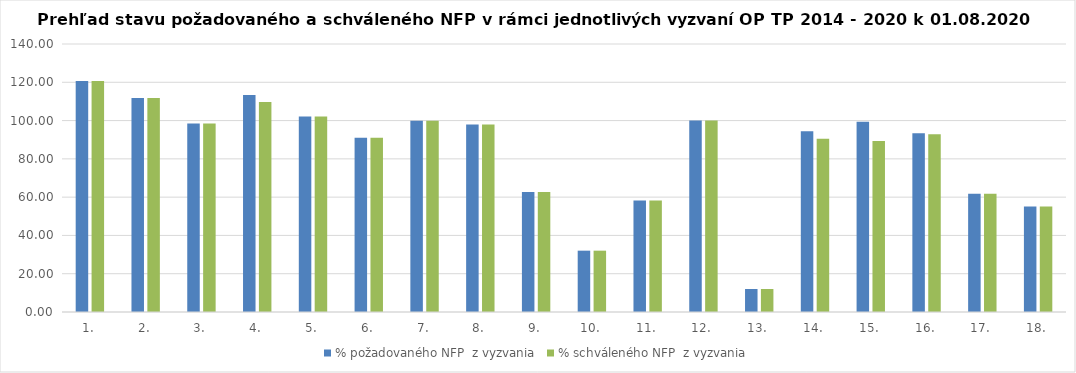
| Category | % požadovaného NFP  z vyzvania | % schváleného NFP  z vyzvania |
|---|---|---|
| 1. | 120.662 | 120.662 |
| 2. | 111.83 | 111.83 |
| 3. | 98.465 | 98.465 |
| 4. | 113.295 | 109.758 |
| 5. | 102.19 | 102.19 |
| 6. | 91.016 | 91.016 |
| 7. | 99.954 | 99.954 |
| 8. | 97.989 | 97.989 |
| 9. | 62.721 | 62.721 |
| 10. | 32.038 | 32.038 |
| 11. | 58.283 | 58.283 |
| 12. | 99.995 | 99.995 |
| 13. | 12.008 | 12.008 |
| 14. | 94.372 | 90.511 |
| 15. | 99.394 | 89.393 |
| 16. | 93.316 | 92.892 |
| 17. | 61.754 | 61.754 |
| 18. | 55.063 | 55.063 |